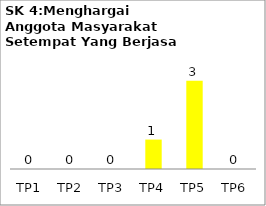
| Category | Bil Pel |
|---|---|
| TP1 | 0 |
| TP2 | 0 |
| TP3 | 0 |
| TP4 | 1 |
| TP5 | 3 |
| TP6 | 0 |